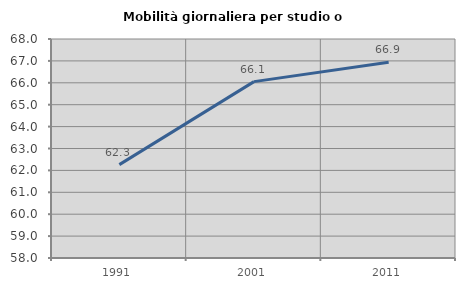
| Category | Mobilità giornaliera per studio o lavoro |
|---|---|
| 1991.0 | 62.263 |
| 2001.0 | 66.054 |
| 2011.0 | 66.936 |